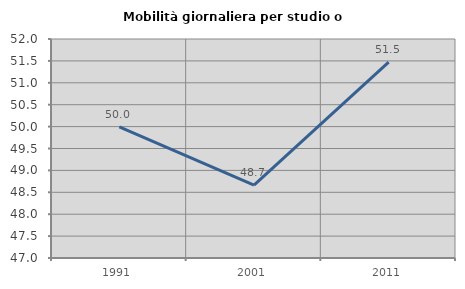
| Category | Mobilità giornaliera per studio o lavoro |
|---|---|
| 1991.0 | 49.994 |
| 2001.0 | 48.663 |
| 2011.0 | 51.473 |